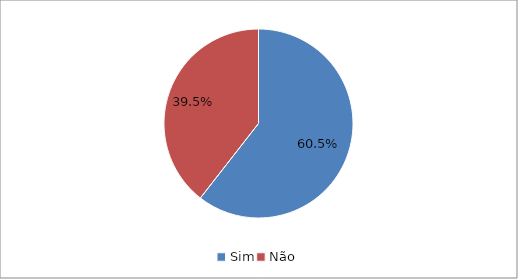
| Category | Series 0 |
|---|---|
| Sim | 0.605 |
| Não | 0.395 |